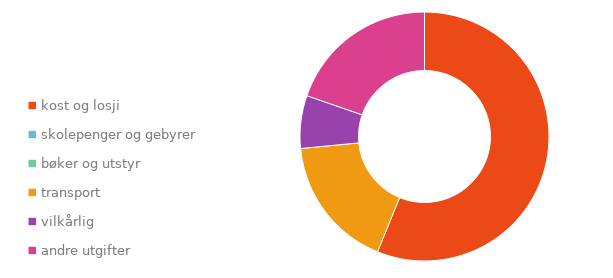
| Category | Series 0 |
|---|---|
| kost og losji | 0.253 |
| skolepenger og gebyrer | 0.336 |
| bøker og utstyr | 0.146 |
| transport | 0.078 |
| vilkårlig | 0.076 |
| andre utgifter | 0.112 |